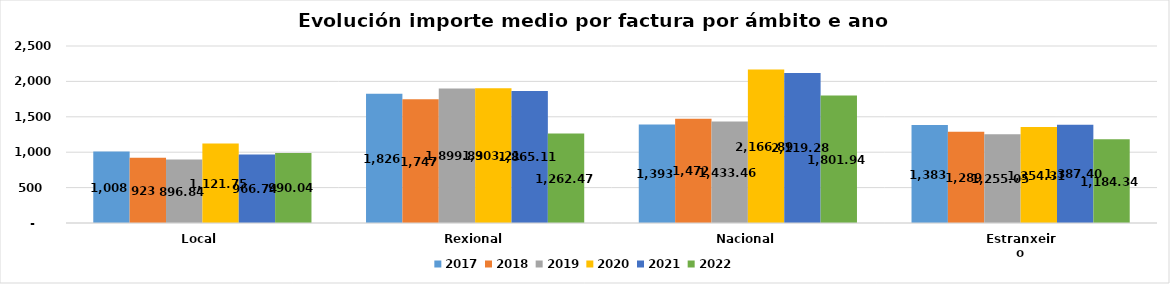
| Category | 2017 | 2018 | 2019 | 2020 | 2021 | 2022 |
|---|---|---|---|---|---|---|
| Local  | 1008.147 | 922.872 | 896.839 | 1121.752 | 966.74 | 990.041 |
| Rexional | 1825.799 | 1746.574 | 1899.826 | 1903.213 | 1865.11 | 1262.469 |
| Nacional | 1392.907 | 1472.454 | 1433.465 | 2166.887 | 2119.28 | 1801.943 |
| Estranxeiro | 1383.137 | 1288.617 | 1255.048 | 1354.307 | 1387.4 | 1184.344 |